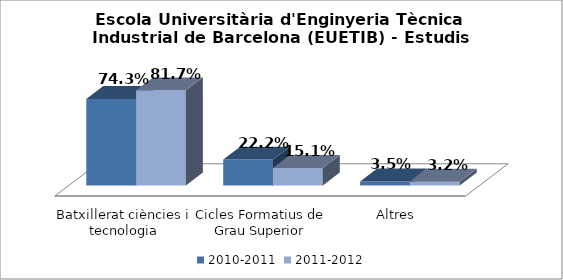
| Category | 2010-2011 | 2011-2012 |
|---|---|---|
| Batxillerat ciències i tecnologia | 0.743 | 0.817 |
| Cicles Formatius de Grau Superior | 0.222 | 0.151 |
| Altres | 0.035 | 0.032 |